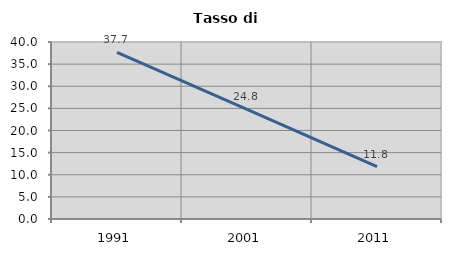
| Category | Tasso di disoccupazione   |
|---|---|
| 1991.0 | 37.666 |
| 2001.0 | 24.767 |
| 2011.0 | 11.847 |